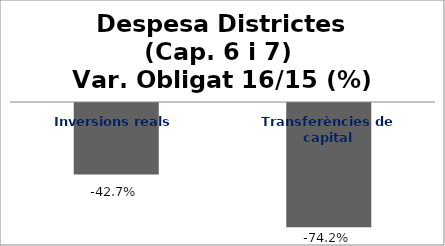
| Category | Series 0 |
|---|---|
| Inversions reals | -0.427 |
| Transferències de capital | -0.742 |